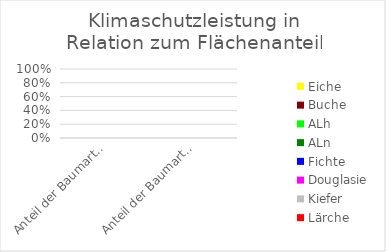
| Category | Lärche | Kiefer | Douglasie | Fichte | ALn | ALh | Buche | Eiche |
|---|---|---|---|---|---|---|---|---|
| Anteil der Baumartengruppe an der Holzbodenfläche [%] | 0 | 0 | 0 | 0 | 0 | 0 | 0 | 0 |
| Anteil der Baumartengruppe an der Klimaschutzleistung [%] | 0 | 0 | 0 | 0 | 0 | 0 | 0 | 0 |